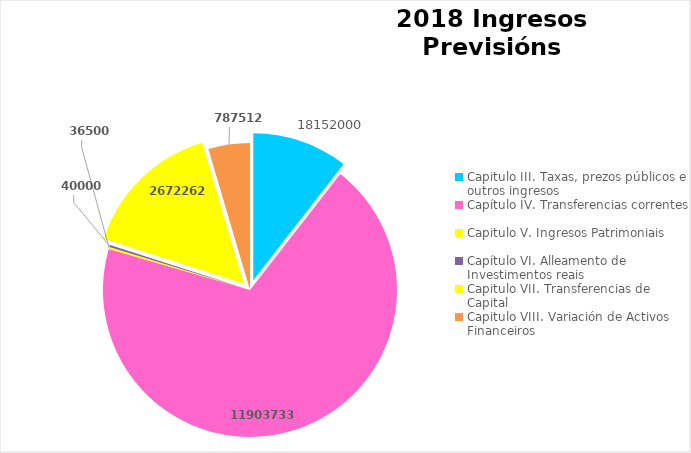
| Category | Series 0 |
|---|---|
| Capitulo III. Taxas, prezos públicos e outros ingresos | 18152000 |
| Capítulo IV. Transferencias correntes | 119037333 |
| Capitulo V. Ingresos Patrimoniais | 365000 |
| Capítulo VI. Alleamento de Investimentos reais | 400000 |
| Capitulo VII. Transferencias de Capital | 26722626 |
| Capitulo VIII. Variación de Activos Financeiros | 7875129 |